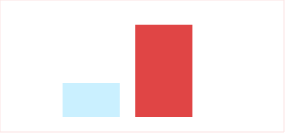
| Category | Series 0 | Series 1 |
|---|---|---|
| 0 | 5416.667 | 6130 |